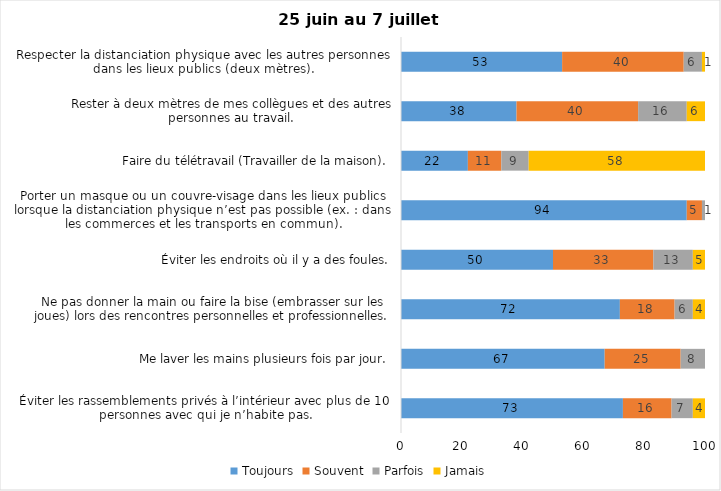
| Category | Toujours | Souvent | Parfois | Jamais |
|---|---|---|---|---|
| Éviter les rassemblements privés à l’intérieur avec plus de 10 personnes avec qui je n’habite pas. | 73 | 16 | 7 | 4 |
| Me laver les mains plusieurs fois par jour. | 67 | 25 | 8 | 0 |
| Ne pas donner la main ou faire la bise (embrasser sur les joues) lors des rencontres personnelles et professionnelles. | 72 | 18 | 6 | 4 |
| Éviter les endroits où il y a des foules. | 50 | 33 | 13 | 5 |
| Porter un masque ou un couvre-visage dans les lieux publics lorsque la distanciation physique n’est pas possible (ex. : dans les commerces et les transports en commun). | 94 | 5 | 1 | 0 |
| Faire du télétravail (Travailler de la maison). | 22 | 11 | 9 | 58 |
| Rester à deux mètres de mes collègues et des autres personnes au travail. | 38 | 40 | 16 | 6 |
| Respecter la distanciation physique avec les autres personnes dans les lieux publics (deux mètres). | 53 | 40 | 6 | 1 |